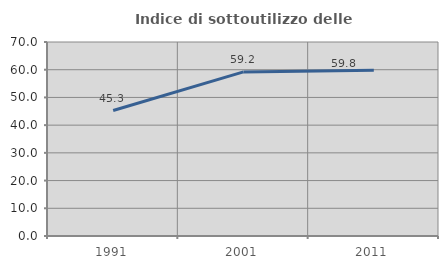
| Category | Indice di sottoutilizzo delle abitazioni  |
|---|---|
| 1991.0 | 45.263 |
| 2001.0 | 59.204 |
| 2011.0 | 59.809 |